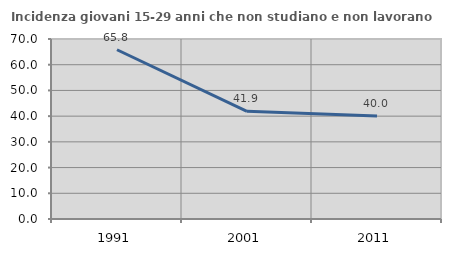
| Category | Incidenza giovani 15-29 anni che non studiano e non lavorano  |
|---|---|
| 1991.0 | 65.823 |
| 2001.0 | 41.874 |
| 2011.0 | 40.041 |